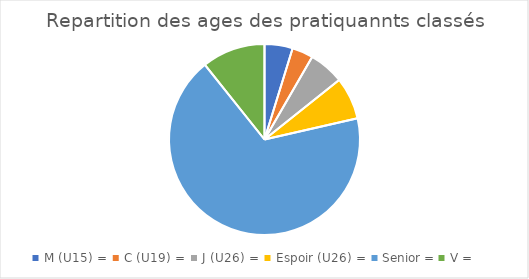
| Category | Series 0 |
|---|---|
| M (U15) =  | 4 |
| C (U19) =  | 3 |
| J (U26) =  | 5 |
| Espoir (U26) =  | 6 |
| Senior = | 57 |
| V =  | 9 |